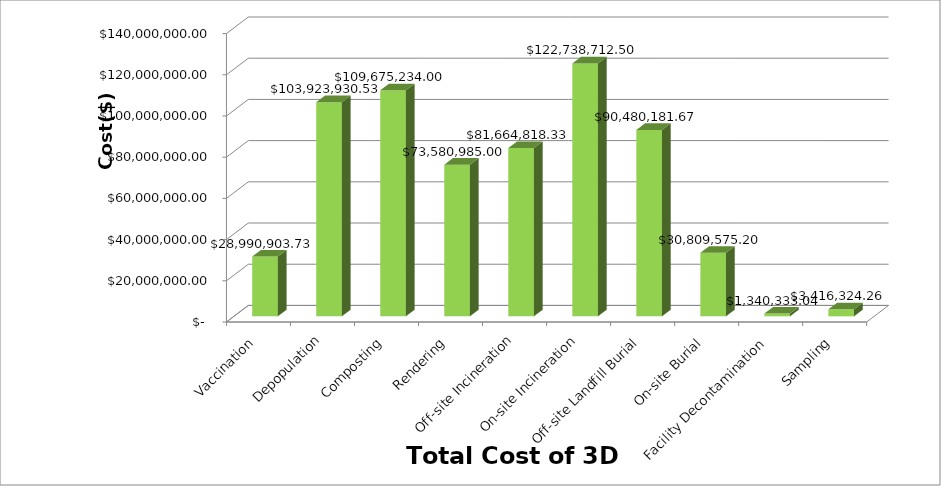
| Category | Series 0 |
|---|---|
| Vaccination | 28990903.729 |
| Depopulation | 103923930.533 |
| Composting | 109675234 |
| Rendering | 73580985 |
| Off-site Incineration | 81664818.333 |
| On-site Incineration | 122738712.5 |
| Off-site Landfill Burial | 90480181.667 |
| On-site Burial | 30809575.203 |
| Facility Decontamination | 1340333.043 |
| Sampling | 3416324.265 |